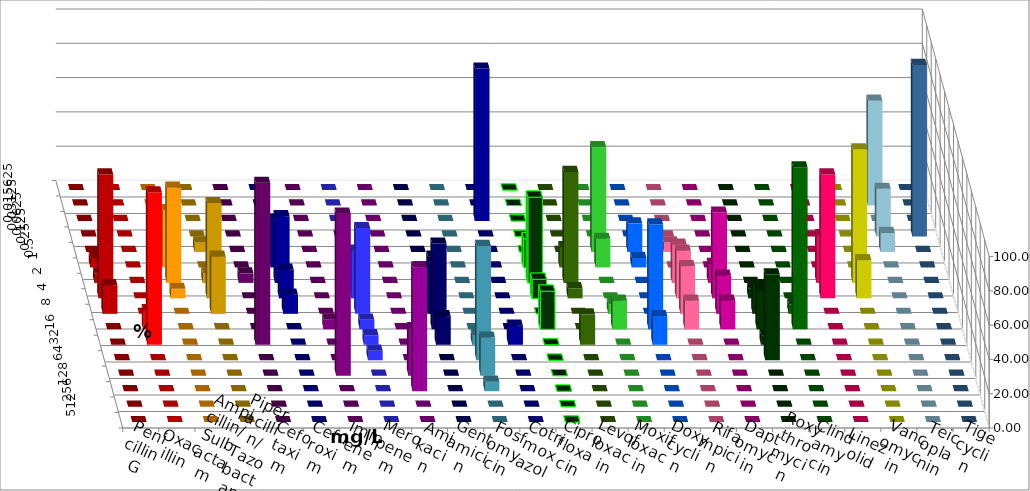
| Category | Penicillin G | Oxacillin | Ampicillin/ Sulbactam | Piperacillin/ Tazobactam | Cefotaxim | Cefuroxim | Imipenem | Meropenem | Amikacin | Gentamicin | Fosfomycin | Cotrimoxazol | Ciprofloxacin | Levofloxacin | Moxifloxacin | Doxycyclin | Rifampicin | Daptomycin | Roxythromycin | Clindamycin | Linezolid | Vancomycin | Teicoplanin | Tigecyclin |
|---|---|---|---|---|---|---|---|---|---|---|---|---|---|---|---|---|---|---|---|---|---|---|---|---|
| 0.015625 | 0 | 0 | 0 | 0 | 0 | 0 | 0 | 0 | 0 | 0 | 0 | 0 | 0 | 0 | 0 | 0 | 0 | 0 | 0 | 0 | 0 | 0 | 0 | 0 |
| 0.03125 | 0 | 0 | 0 | 0 | 0 | 0 | 0 | 0 | 0 | 0 | 0 | 0 | 0 | 0 | 0 | 0 | 0 | 0 | 0 | 0 | 0 | 0 | 0 | 61.111 |
| 0.0625 | 0 | 0 | 0 | 0 | 0 | 0 | 0 | 0 | 0 | 0 | 0 | 88.889 | 0 | 0 | 0 | 0 | 0 | 0 | 0 | 0 | 0 | 0 | 0 | 0 |
| 0.125 | 0 | 0 | 5.556 | 0 | 0 | 0 | 0 | 0 | 0 | 0 | 0 | 0 | 0 | 0 | 0 | 0 | 0 | 0 | 0 | 0 | 0 | 0 | 100 | 27.778 |
| 0.25 | 0 | 0 | 0 | 5.556 | 0 | 0 | 5.556 | 0 | 0 | 0 | 0 | 0 | 0 | 0 | 61.111 | 16.667 | 5.556 | 0 | 0 | 0 | 0 | 0 | 0 | 11.111 |
| 0.5 | 5.556 | 0 | 33.333 | 0 | 0 | 0 | 27.778 | 0 | 0 | 0 | 0 | 0 | 16.667 | 11.765 | 16.667 | 5.556 | 0 | 0 | 0 | 0 | 0 | 0 | 0 | 0 |
| 1.0 | 5.556 | 0 | 55.556 | 5.556 | 5.556 | 0 | 38.889 | 5.556 | 0 | 0 | 0 | 0 | 50 | 64.706 | 0 | 0 | 22.222 | 11.111 | 0 | 0 | 27.778 | 77.778 | 0 | 0 |
| 2.0 | 72.222 | 0 | 5.556 | 55.556 | 0 | 0 | 16.667 | 27.778 | 0 | 0 | 0 | 0 | 11.111 | 5.882 | 0 | 0 | 27.778 | 50 | 5.556 | 0 | 72.222 | 22.222 | 0 | 0 |
| 4.0 | 16.667 | 0 | 0 | 33.333 | 0 | 0 | 11.111 | 50 | 0 | 33.333 | 0 | 0 | 0 | 0 | 5.556 | 0 | 27.778 | 22.222 | 16.667 | 5.556 | 0 | 0 | 0 | 0 |
| 8.0 | 0 | 11.111 | 0 | 0 | 0 | 5.556 | 0 | 5.556 | 0 | 50 | 0 | 0 | 22.222 | 0 | 16.667 | 61.111 | 16.667 | 16.667 | 22.222 | 94.444 | 0 | 0 | 0 | 0 |
| 16.0 | 0 | 88.889 | 0 | 0 | 94.444 | 0 | 0 | 5.556 | 0 | 16.667 | 5.556 | 11.111 | 0 | 17.647 | 0 | 16.667 | 0 | 0 | 5.556 | 0 | 0 | 0 | 0 | 0 |
| 32.0 | 0 | 0 | 0 | 0 | 0 | 0 | 0 | 5.556 | 0 | 0 | 66.667 | 0 | 0 | 0 | 0 | 0 | 0 | 0 | 50 | 0 | 0 | 0 | 0 | 0 |
| 64.0 | 0 | 0 | 0 | 0 | 0 | 94.444 | 0 | 0 | 27.778 | 0 | 22.222 | 0 | 0 | 0 | 0 | 0 | 0 | 0 | 0 | 0 | 0 | 0 | 0 | 0 |
| 128.0 | 0 | 0 | 0 | 0 | 0 | 0 | 0 | 0 | 72.222 | 0 | 5.556 | 0 | 0 | 0 | 0 | 0 | 0 | 0 | 0 | 0 | 0 | 0 | 0 | 0 |
| 256.0 | 0 | 0 | 0 | 0 | 0 | 0 | 0 | 0 | 0 | 0 | 0 | 0 | 0 | 0 | 0 | 0 | 0 | 0 | 0 | 0 | 0 | 0 | 0 | 0 |
| 512.0 | 0 | 0 | 0 | 0 | 0 | 0 | 0 | 0 | 0 | 0 | 0 | 0 | 0 | 0 | 0 | 0 | 0 | 0 | 0 | 0 | 0 | 0 | 0 | 0 |